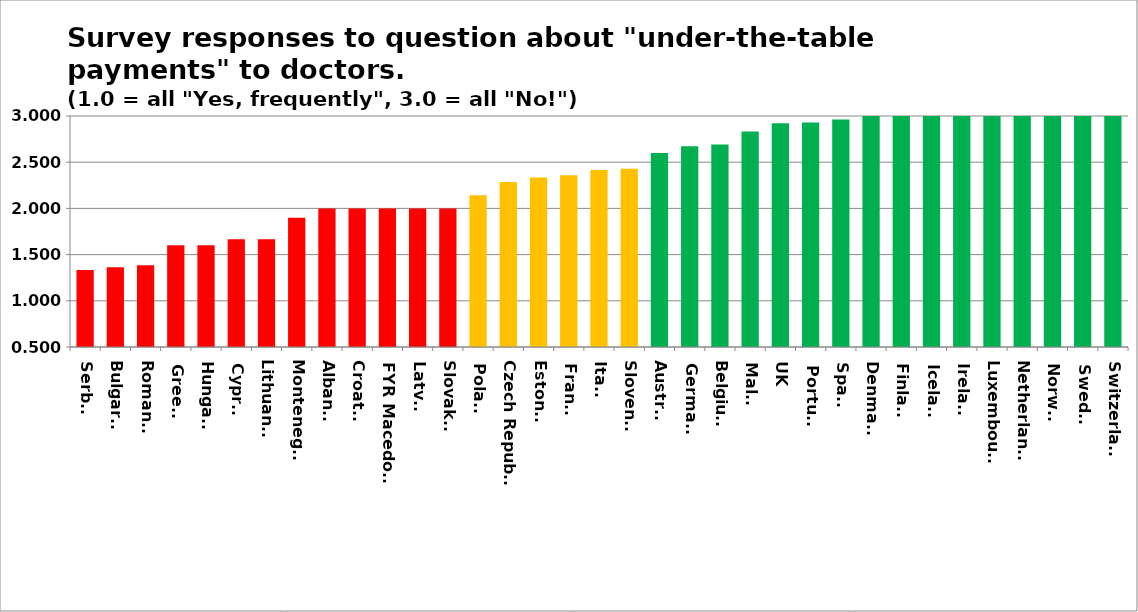
| Category | Series 0 |
|---|---|
| Serbia | 1.333 |
| Bulgaria | 1.364 |
| Romania | 1.385 |
| Greece | 1.6 |
| Hungary | 1.6 |
| Cyprus | 1.667 |
| Lithuania | 1.667 |
| Montenegro | 1.9 |
| Albania | 2 |
| Croatia | 2 |
| FYR Macedonia | 2 |
| Latvia | 2 |
| Slovakia | 2 |
| Poland | 2.143 |
| Czech Republic | 2.286 |
| Estonia | 2.333 |
| France | 2.36 |
| Italy | 2.415 |
| Slovenia | 2.429 |
| Austria | 2.6 |
| Germany | 2.673 |
| Belgium | 2.692 |
| Malta | 2.833 |
| UK | 2.922 |
| Portugal | 2.929 |
| Spain | 2.962 |
| Denmark | 3 |
| Finland | 3 |
| Iceland | 3 |
| Ireland | 3 |
| Luxembourg | 3 |
| Netherlands | 3 |
| Norway | 3 |
| Sweden | 3 |
| Switzerland | 3 |